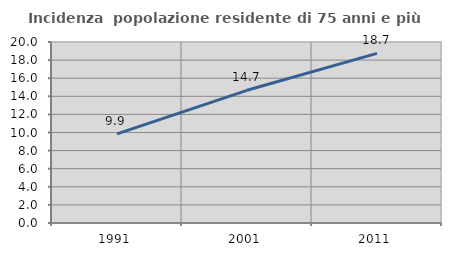
| Category | Incidenza  popolazione residente di 75 anni e più |
|---|---|
| 1991.0 | 9.854 |
| 2001.0 | 14.662 |
| 2011.0 | 18.741 |